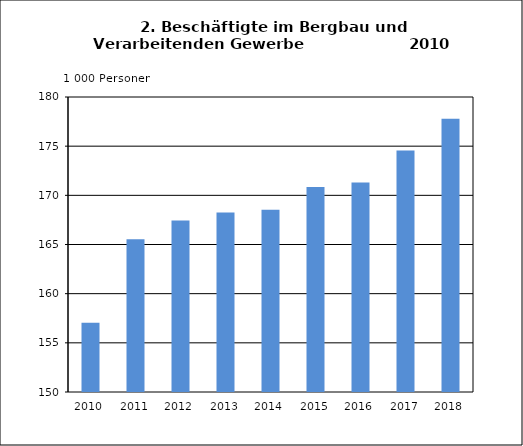
| Category | Beschäftigte |
|---|---|
| 2010.0 | 157.043 |
| 2011.0 | 165.528 |
| 2012.0 | 167.446 |
| 2013.0 | 168.246 |
| 2014.0 | 168.527 |
| 2015.0 | 170.836 |
| 2016.0 | 171.305 |
| 2017.0 | 174.572 |
| 2018.0 | 177.778 |